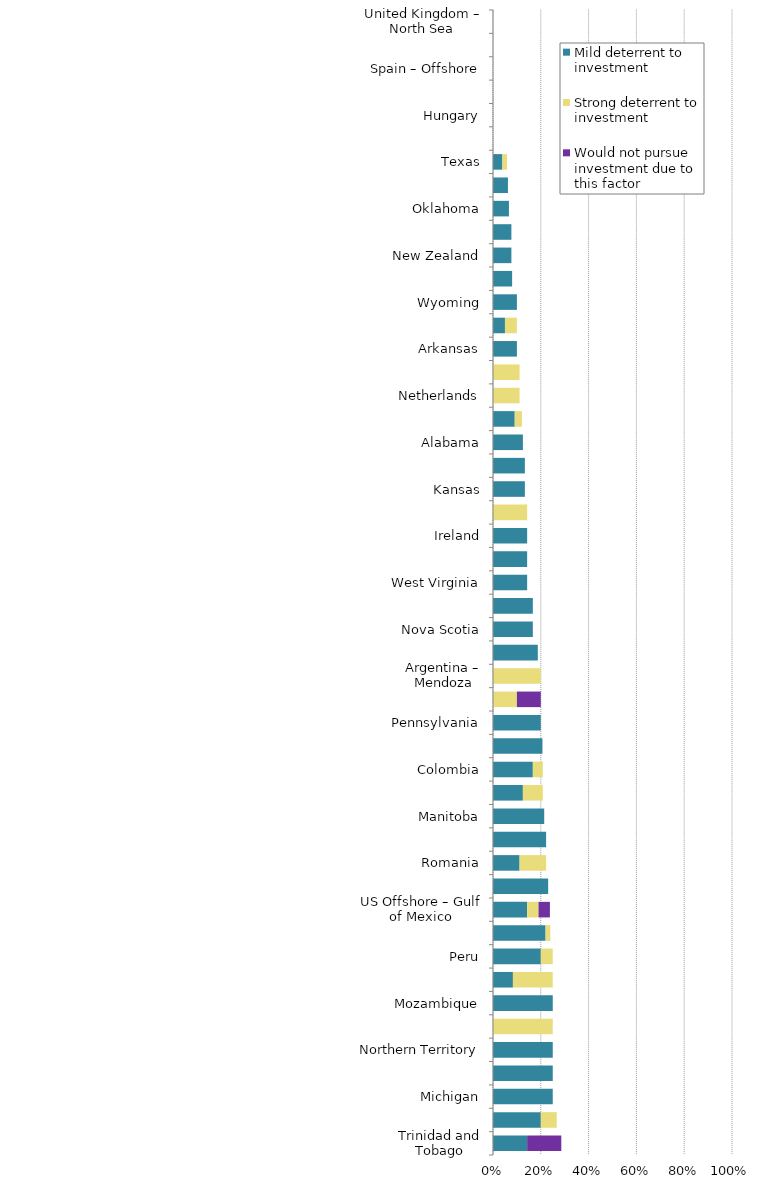
| Category | Mild deterrent to investment | Strong deterrent to investment | Would not pursue investment due to this factor |
|---|---|---|---|
| Trinidad and Tobago | 0.143 | 0 | 0.143 |
| Australia – Offshore | 0.2 | 0.067 | 0 |
| Michigan | 0.25 | 0 | 0 |
| Utah | 0.25 | 0 | 0 |
| Northern Territory | 0.25 | 0 | 0 |
| France | 0 | 0.25 | 0 |
| Mozambique | 0.25 | 0 | 0 |
| Tunisia | 0.083 | 0.167 | 0 |
| Peru | 0.2 | 0.05 | 0 |
| Alberta | 0.22 | 0.02 | 0 |
| US Offshore – Gulf of Mexico | 0.143 | 0.048 | 0.048 |
| United Arab Emirates | 0.231 | 0 | 0 |
| Romania | 0.111 | 0.111 | 0 |
| Namibia | 0.222 | 0 | 0 |
| Manitoba | 0.214 | 0 | 0 |
| Colorado | 0.125 | 0.083 | 0 |
| Colombia | 0.167 | 0.042 | 0 |
| Saskatchewan | 0.207 | 0 | 0 |
| Pennsylvania | 0.2 | 0 | 0 |
| Spain – Onshore | 0 | 0.1 | 0.1 |
| Argentina – Mendoza | 0 | 0.2 | 0 |
| South Australia | 0.188 | 0 | 0 |
| Nova Scotia | 0.167 | 0 | 0 |
| Illinois | 0.167 | 0 | 0 |
| West Virginia | 0.143 | 0 | 0 |
| Brunei | 0.143 | 0 | 0 |
| Ireland | 0.143 | 0 | 0 |
| Suriname | 0 | 0.143 | 0 |
| Kansas | 0.133 | 0 | 0 |
| Mississippi | 0.133 | 0 | 0 |
| Alabama | 0.125 | 0 | 0 |
| Louisiana | 0.091 | 0.03 | 0 |
| Netherlands | 0 | 0.111 | 0 |
| Kenya | 0 | 0.111 | 0 |
| Arkansas | 0.1 | 0 | 0 |
| New Mexico | 0.05 | 0.05 | 0 |
| Wyoming | 0.1 | 0 | 0 |
| North Dakota | 0.08 | 0 | 0 |
| New Zealand | 0.077 | 0 | 0 |
| Norway – North Sea | 0.077 | 0 | 0 |
| Oklahoma | 0.067 | 0 | 0 |
| Montana | 0.062 | 0 | 0 |
| Texas | 0.039 | 0.02 | 0 |
| Newfoundland & Labrador | 0 | 0 | 0 |
| Hungary | 0 | 0 | 0 |
| Norway – Other Offshore (ex. Nth. Sea) | 0 | 0 | 0 |
| Spain – Offshore | 0 | 0 | 0 |
| UK – Other Offshore (ex. Nth. Sea) | 0 | 0 | 0 |
| United Kingdom – North Sea | 0 | 0 | 0 |